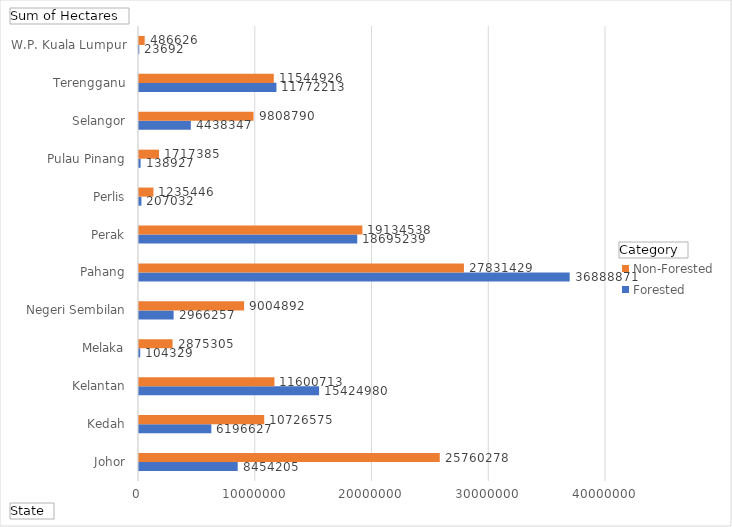
| Category | Forested | Non-Forested |
|---|---|---|
| Johor | 8454205 | 25760278 |
| Kedah | 6196627 | 10726575 |
| Kelantan | 15424980 | 11600713 |
| Melaka | 104329 | 2875305 |
| Negeri Sembilan | 2966257 | 9004892 |
| Pahang | 36888871 | 27831429 |
| Perak | 18695239 | 19134538 |
| Perlis | 207032 | 1235446 |
| Pulau Pinang | 138927 | 1717385 |
| Selangor | 4438347 | 9808790 |
| Terengganu | 11772213 | 11544926 |
| W.P. Kuala Lumpur | 23692 | 486626 |